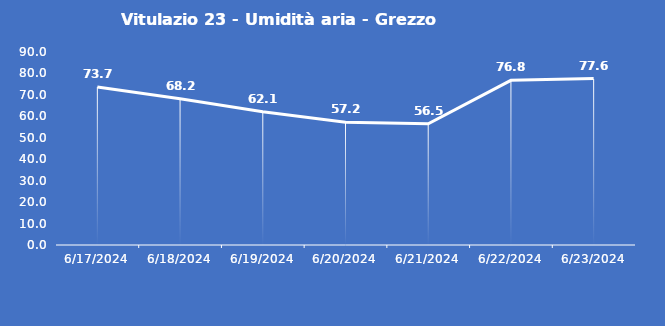
| Category | Vitulazio 23 - Umidità aria - Grezzo (%) |
|---|---|
| 6/17/24 | 73.7 |
| 6/18/24 | 68.2 |
| 6/19/24 | 62.1 |
| 6/20/24 | 57.2 |
| 6/21/24 | 56.5 |
| 6/22/24 | 76.8 |
| 6/23/24 | 77.6 |